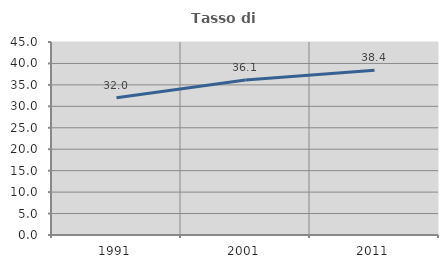
| Category | Tasso di occupazione   |
|---|---|
| 1991.0 | 31.99 |
| 2001.0 | 36.131 |
| 2011.0 | 38.427 |